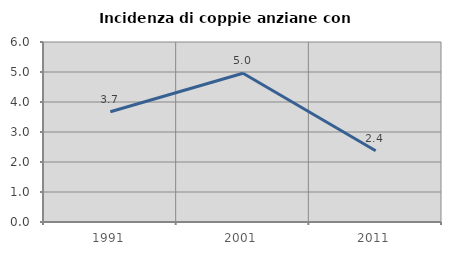
| Category | Incidenza di coppie anziane con figli |
|---|---|
| 1991.0 | 3.673 |
| 2001.0 | 4.956 |
| 2011.0 | 2.375 |